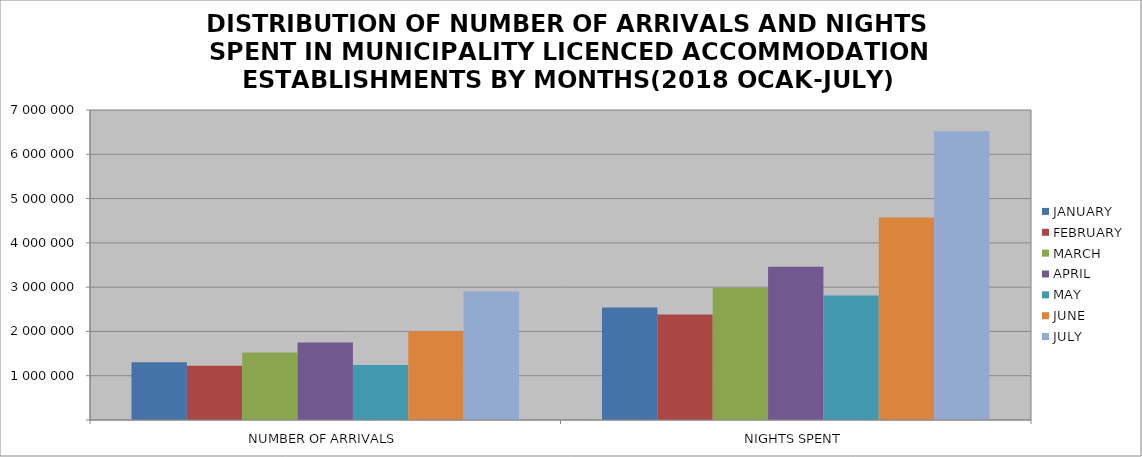
| Category | JANUARY | FEBRUARY | MARCH | APRIL | MAY | JUNE | JULY |
|---|---|---|---|---|---|---|---|
| NUMBER OF ARRIVALS | 1303353 | 1223475 | 1526172 | 1749085 | 1240889 | 2003881 | 2904028 |
| NIGHTS SPENT | 2542103 | 2381300 | 2986820 | 3463261 | 2810808 | 4572629 | 6517690 |